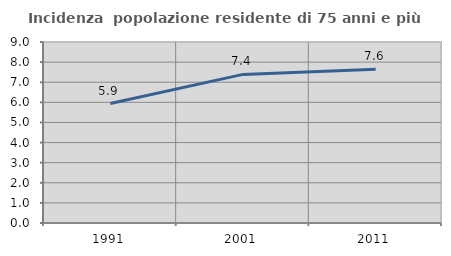
| Category | Incidenza  popolazione residente di 75 anni e più |
|---|---|
| 1991.0 | 5.941 |
| 2001.0 | 7.39 |
| 2011.0 | 7.648 |